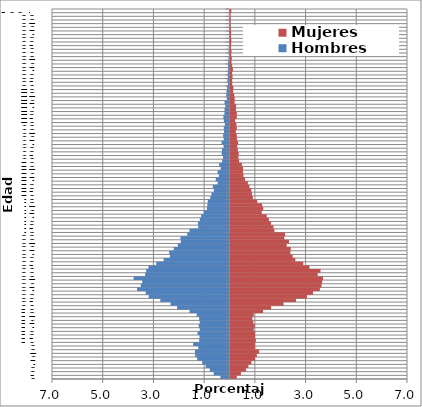
| Category | Hombres | Mujeres |
|---|---|---|
| 0 | -0.358 | 0.25 |
| 1 | -0.625 | 0.411 |
| 2 | -0.778 | 0.615 |
| 3 | -0.939 | 0.708 |
| 4 | -1.076 | 0.824 |
| 5 | -1.275 | 0.965 |
| 6 | -1.356 | 1.04 |
| 7 | -1.363 | 1.128 |
| 8 | -1.232 | 0.97 |
| 9 | -1.431 | 0.968 |
| 10 | -1.195 | 0.999 |
| 11 | -1.182 | 0.965 |
| 12 | -1.26 | 0.968 |
| 13 | -1.176 | 0.917 |
| 14 | -1.213 | 0.958 |
| 15 | -1.176 | 0.9 |
| 16 | -1.198 | 0.864 |
| 17 | -1.297 | 0.917 |
| 18 | -1.577 | 1.285 |
| 19 | -2.069 | 1.601 |
| 20 | -2.327 | 2.094 |
| 21 | -2.728 | 2.586 |
| 22 | -3.185 | 3.016 |
| 23 | -3.304 | 3.253 |
| 24 | -3.646 | 3.525 |
| 25 | -3.5 | 3.589 |
| 26 | -3.444 | 3.616 |
| 27 | -3.78 | 3.649 |
| 28 | -3.329 | 3.438 |
| 29 | -3.285 | 3.551 |
| 30 | -3.195 | 3.114 |
| 31 | -2.89 | 2.867 |
| 32 | -2.598 | 2.557 |
| 33 | -2.349 | 2.451 |
| 34 | -2.38 | 2.36 |
| 35 | -2.199 | 2.377 |
| 36 | -2.038 | 2.216 |
| 37 | -1.922 | 2.307 |
| 38 | -1.935 | 2.122 |
| 39 | -1.667 | 2.151 |
| 40 | -1.58 | 1.731 |
| 41 | -1.232 | 1.695 |
| 42 | -1.244 | 1.594 |
| 43 | -1.17 | 1.513 |
| 44 | -1.117 | 1.429 |
| 45 | -1.017 | 1.234 |
| 46 | -0.89 | 1.292 |
| 47 | -0.874 | 1.246 |
| 48 | -0.855 | 1.054 |
| 49 | -0.759 | 0.881 |
| 50 | -0.712 | 0.845 |
| 51 | -0.616 | 0.821 |
| 52 | -0.659 | 0.749 |
| 53 | -0.47 | 0.684 |
| 54 | -0.541 | 0.574 |
| 55 | -0.42 | 0.511 |
| 56 | -0.47 | 0.492 |
| 57 | -0.348 | 0.497 |
| 58 | -0.408 | 0.449 |
| 59 | -0.289 | 0.336 |
| 60 | -0.255 | 0.312 |
| 61 | -0.308 | 0.324 |
| 62 | -0.296 | 0.293 |
| 63 | -0.233 | 0.267 |
| 64 | -0.311 | 0.298 |
| 65 | -0.23 | 0.252 |
| 66 | -0.252 | 0.247 |
| 67 | -0.215 | 0.211 |
| 68 | -0.224 | 0.252 |
| 69 | -0.184 | 0.235 |
| 70 | -0.224 | 0.18 |
| 71 | -0.243 | 0.247 |
| 72 | -0.199 | 0.25 |
| 73 | -0.199 | 0.216 |
| 74 | -0.165 | 0.223 |
| 75 | -0.196 | 0.161 |
| 76 | -0.103 | 0.166 |
| 77 | -0.128 | 0.146 |
| 78 | -0.112 | 0.103 |
| 79 | -0.093 | 0.115 |
| 80 | -0.065 | 0.067 |
| 81 | -0.081 | 0.067 |
| 82 | -0.065 | 0.082 |
| 83 | -0.065 | 0.065 |
| 84 | -0.056 | 0.096 |
| 85 | -0.059 | 0.065 |
| 86 | -0.056 | 0.041 |
| 87 | -0.037 | 0.05 |
| 88 | -0.028 | 0.029 |
| 89 | -0.04 | 0.041 |
| 90 | -0.028 | 0.012 |
| 91 | -0.019 | 0.026 |
| 92 | -0.016 | 0.034 |
| 93 | -0.009 | 0.017 |
| 94 | -0.012 | 0.024 |
| 95 | -0.006 | 0.012 |
| 96 | -0.016 | 0.002 |
| 97 | -0.003 | 0.005 |
| 98 | -0.003 | 0.007 |
| 99 | 0 | 0.005 |
| 100+ | -0.019 | 0.034 |